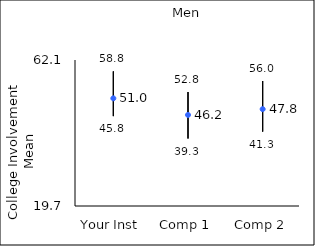
| Category | 25th percentile | 75th percentile | Mean |
|---|---|---|---|
| Your Inst | 45.8 | 58.8 | 50.97 |
| Comp 1 | 39.3 | 52.8 | 46.15 |
| Comp 2 | 41.3 | 56 | 47.83 |